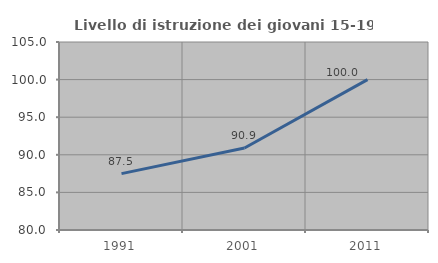
| Category | Livello di istruzione dei giovani 15-19 anni |
|---|---|
| 1991.0 | 87.5 |
| 2001.0 | 90.909 |
| 2011.0 | 100 |